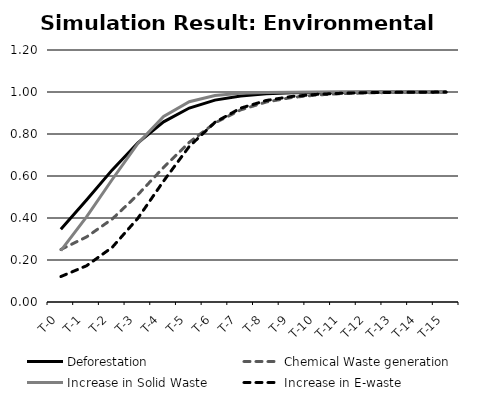
| Category | Deforestation | Chemical Waste generation | Increase in Solid Waste | Increase in E-waste |
|---|---|---|---|---|
| T-0 | 0.347 | 0.25 | 0.245 | 0.121 |
| T-1 | 0.486 | 0.31 | 0.405 | 0.172 |
| T-2 | 0.629 | 0.395 | 0.583 | 0.26 |
| T-3 | 0.758 | 0.511 | 0.755 | 0.399 |
| T-4 | 0.858 | 0.641 | 0.884 | 0.576 |
| T-5 | 0.924 | 0.76 | 0.954 | 0.741 |
| T-6 | 0.961 | 0.853 | 0.983 | 0.856 |
| T-7 | 0.981 | 0.915 | 0.994 | 0.923 |
| T-8 | 0.991 | 0.952 | 0.998 | 0.96 |
| T-9 | 0.996 | 0.974 | 0.999 | 0.979 |
| T-10 | 0.998 | 0.986 | 1 | 0.989 |
| T-11 | 0.999 | 0.993 | 1 | 0.994 |
| T-12 | 1 | 0.996 | 1 | 0.997 |
| T-13 | 1 | 0.998 | 1 | 0.998 |
| T-14 | 1 | 0.999 | 1 | 0.999 |
| T-15 | 1 | 0.999 | 1 | 1 |